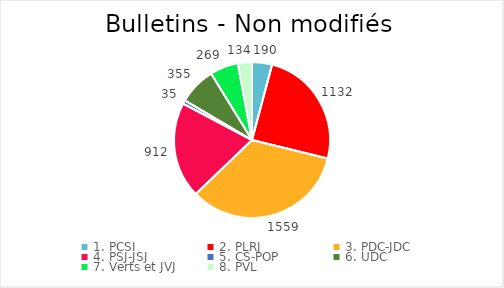
| Category | Series 0 |
|---|---|
| 1. PCSI | 190 |
| 2. PLRJ | 1132 |
| 3. PDC-JDC | 1559 |
| 4. PSJ-JSJ | 912 |
| 5. CS-POP | 35 |
| 6. UDC | 355 |
| 7. Verts et JVJ | 269 |
| 8. PVL | 134 |